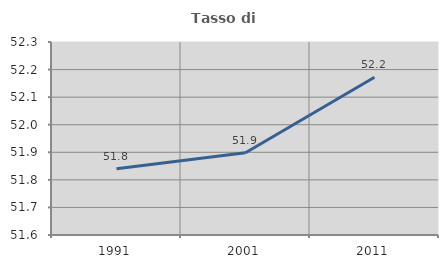
| Category | Tasso di occupazione   |
|---|---|
| 1991.0 | 51.84 |
| 2001.0 | 51.898 |
| 2011.0 | 52.172 |